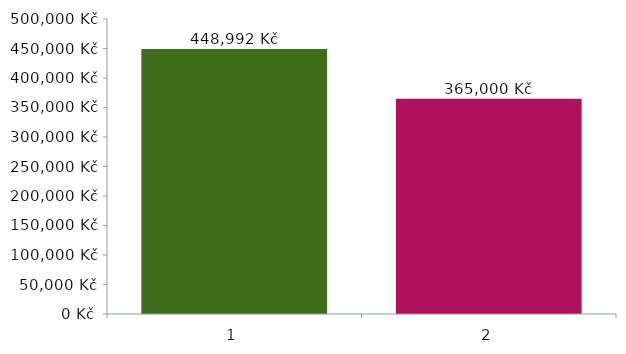
| Category | Series 0 |
|---|---|
| 0 | 448992 |
| 1 | 365000 |